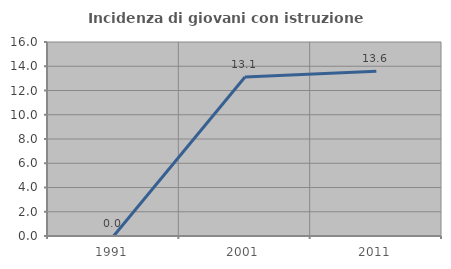
| Category | Incidenza di giovani con istruzione universitaria |
|---|---|
| 1991.0 | 0 |
| 2001.0 | 13.115 |
| 2011.0 | 13.58 |